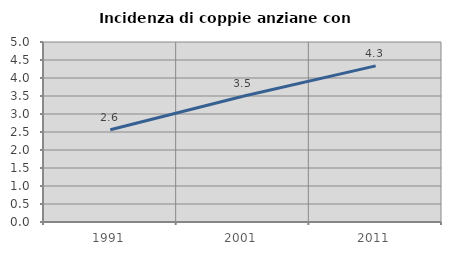
| Category | Incidenza di coppie anziane con figli |
|---|---|
| 1991.0 | 2.563 |
| 2001.0 | 3.491 |
| 2011.0 | 4.337 |